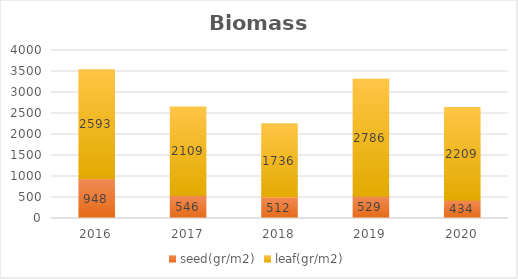
| Category | seed(gr/m2) | leaf(gr/m2) |
|---|---|---|
| 2016.0 | 948 | 2593 |
| 2017.0 | 546 | 2109 |
| 2018.0 | 512 | 1736 |
| 2019.0 | 529 | 2786 |
| 2020.0 | 434 | 2209 |